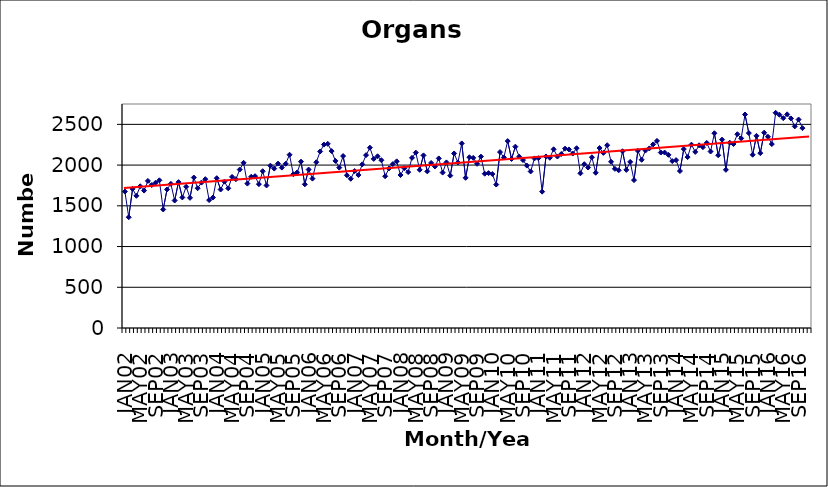
| Category | Series 0 |
|---|---|
| JAN02 | 1675 |
| FEB02 | 1360 |
| MAR02 | 1708 |
| APR02 | 1623 |
| MAY02 | 1740 |
| JUN02 | 1687 |
| JUL02 | 1806 |
| AUG02 | 1755 |
| SEP02 | 1783 |
| OCT02 | 1813 |
| NOV02 | 1455 |
| DEC02 | 1701 |
| JAN03 | 1770 |
| FEB03 | 1565 |
| MAR03 | 1791 |
| APR03 | 1603 |
| MAY03 | 1734 |
| JUN03 | 1598 |
| JUL03 | 1847 |
| AUG03 | 1716 |
| SEP03 | 1785 |
| OCT03 | 1827 |
| NOV03 | 1570 |
| DEC03 | 1602 |
| JAN04 | 1839 |
| FEB04 | 1700 |
| MAR04 | 1797 |
| APR04 | 1715 |
| MAY04 | 1855 |
| JUN04 | 1827 |
| JUL04 | 1945 |
| AUG04 | 2028 |
| SEP04 | 1773 |
| OCT04 | 1857 |
| NOV04 | 1864 |
| DEC04 | 1766 |
| JAN05 | 1925 |
| FEB05 | 1750 |
| MAR05 | 1993 |
| APR05 | 1957 |
| MAY05 | 2018 |
| JUN05 | 1969 |
| JUL05 | 2016 |
| AUG05 | 2127 |
| SEP05 | 1888 |
| OCT05 | 1910 |
| NOV05 | 2042 |
| DEC05 | 1764 |
| JAN06 | 1945 |
| FEB06 | 1834 |
| MAR06 | 2035 |
| APR06 | 2167 |
| MAY06 | 2252 |
| JUN06 | 2261 |
| JUL06 | 2172 |
| AUG06 | 2051 |
| SEP06 | 1969 |
| OCT06 | 2111 |
| NOV06 | 1875 |
| DEC06 | 1832 |
| JAN07 | 1927 |
| FEB07 | 1878 |
| MAR07 | 2009 |
| APR07 | 2122 |
| MAY07 | 2214 |
| JUN07 | 2076 |
| JUL07 | 2108 |
| AUG07 | 2060 |
| SEP07 | 1863 |
| OCT07 | 1959 |
| NOV07 | 2012 |
| DEC07 | 2046 |
| JAN08 | 1878 |
| FEB08 | 1962 |
| MAR08 | 1914 |
| APR08 | 2089 |
| MAY08 | 2153 |
| JUN08 | 1942 |
| JUL08 | 2119 |
| AUG08 | 1923 |
| SEP08 | 2026 |
| OCT08 | 1983 |
| NOV08 | 2082 |
| DEC08 | 1908 |
| JAN09 | 2033 |
| FEB09 | 1871 |
| MAR09 | 2143 |
| APR09 | 2032 |
| MAY09 | 2266 |
| JUN09 | 1844 |
| JUL09 | 2096 |
| AUG09 | 2089 |
| SEP09 | 2016 |
| OCT09 | 2104 |
| NOV09 | 1894 |
| DEC09 | 1901 |
| JAN10 | 1890 |
| FEB10 | 1761 |
| MAR10 | 2160 |
| APR10 | 2094 |
| MAY10 | 2295 |
| JUN10 | 2075 |
| JUL10 | 2226 |
| AUG10 | 2104 |
| SEP10 | 2062 |
| OCT10 | 1994 |
| NOV10 | 1922 |
| DEC10 | 2082 |
| JAN11 | 2085 |
| FEB11 | 1674 |
| MAR11 | 2106 |
| APR11 | 2090 |
| MAY11 | 2194 |
| JUN11 | 2105 |
| JUL11 | 2136 |
| AUG11 | 2202 |
| SEP11 | 2192 |
| OCT11 | 2142 |
| NOV11 | 2207 |
| DEC11 | 1899 |
| JAN12 | 2011 |
| FEB12 | 1970 |
| MAR12 | 2096 |
| APR12 | 1906 |
| MAY12 | 2210 |
| JUN12 | 2150 |
| JUL12 | 2244 |
| AUG12 | 2041 |
| SEP12 | 1954 |
| OCT12 | 1936 |
| NOV12 | 2170 |
| DEC12 | 1941 |
| JAN13 | 2039 |
| FEB13 | 1816 |
| MAR13 | 2175 |
| APR13 | 2065 |
| MAY13 | 2179 |
| JUN13 | 2205 |
| JUL13 | 2254 |
| AUG13 | 2297 |
| SEP13 | 2154 |
| OCT13 | 2154 |
| NOV13 | 2126 |
| DEC13 | 2049 |
| JAN14 | 2061 |
| FEB14 | 1927 |
| MAR14 | 2197 |
| APR14 | 2098 |
| MAY14 | 2251 |
| JUN14 | 2162 |
| JUL14 | 2243 |
| AUG14 | 2220 |
| SEP14 | 2272 |
| OCT14 | 2167 |
| NOV14 | 2391 |
| DEC14 | 2121 |
| JAN15 | 2312 |
| FEB15 | 1942 |
| MAR15 | 2275 |
| APR15 | 2259 |
| MAY15 | 2379 |
| JUN15 | 2328 |
| JUL15 | 2621 |
| AUG15 | 2393 |
| SEP15 | 2127 |
| OCT15 | 2359 |
| NOV15 | 2147 |
| DEC15 | 2398 |
| JAN16 | 2348 |
| FEB16 | 2258 |
| MAR16 | 2642 |
| APR16 | 2618 |
| MAY16 | 2576 |
| JUN16 | 2623 |
| JUL16 | 2573 |
| AUG16 | 2475 |
| SEP16 | 2559 |
| OCT16 | 2454 |